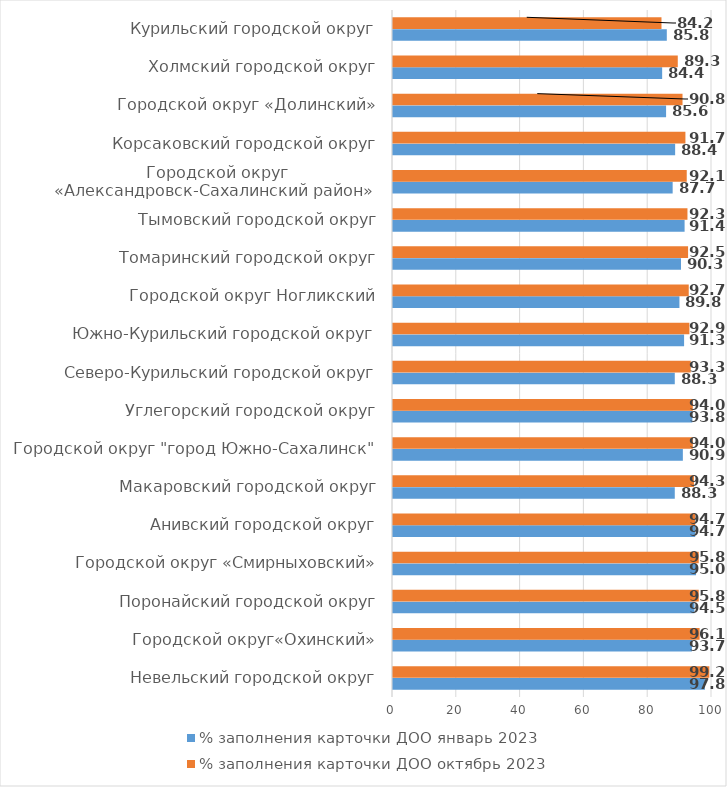
| Category | % заполнения карточки ДОО январь 2023 | % заполнения карточки ДОО октябрь 2023 |
|---|---|---|
| Невельский городской округ | 97.778 | 99.167 |
| Городской округ«Охинский» | 93.704 | 96.111 |
| Поронайский городской округ | 94.5 | 95.833 |
| Городской округ «Смирныховский» | 95 | 95.833 |
| Анивский городской округ | 94.722 | 94.722 |
| Макаровский городской округ | 88.333 | 94.333 |
| Городской округ "город Южно-Сахалинск" | 90.864 | 93.981 |
| Углегорский городской округ | 93.846 | 93.974 |
| Северо-Курильский городской округ | 88.333 | 93.333 |
| Южно-Курильский городской округ | 91.25 | 92.917 |
| Городской округ Ногликский | 89.792 | 92.708 |
| Томаринский городской округ | 90.278 | 92.5 |
| Тымовский городской округ | 91.41 | 92.308 |
| Городской округ «Александровск-Сахалинский район»  | 87.667 | 92.083 |
| Корсаковский городской округ | 88.444 | 91.667 |
| Городской округ «Долинский» | 85.606 | 90.758 |
| Холмский городской округ | 84.375 | 89.271 |
| Курильский городской округ | 85.833 | 84.167 |